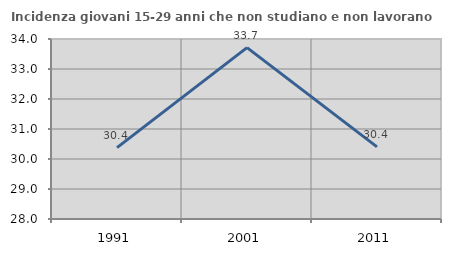
| Category | Incidenza giovani 15-29 anni che non studiano e non lavorano  |
|---|---|
| 1991.0 | 30.38 |
| 2001.0 | 33.712 |
| 2011.0 | 30.405 |